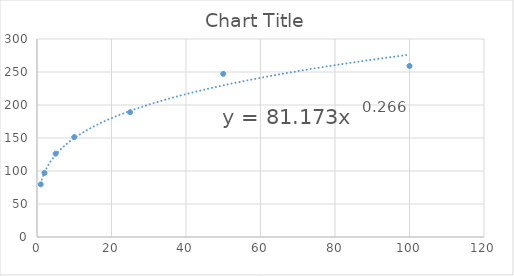
| Category | Series 0 |
|---|---|
| 1.0 | 79.775 |
| 2.0 | 97.051 |
| 5.0 | 126.268 |
| 10.0 | 151.42 |
| 25.0 | 189.021 |
| 50.0 | 247.2 |
| 100.0 | 259.141 |